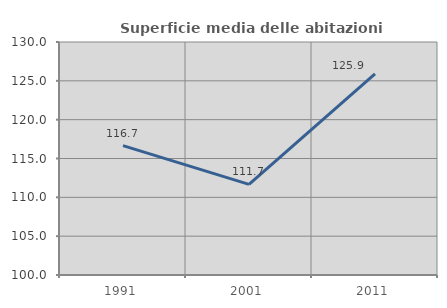
| Category | Superficie media delle abitazioni occupate |
|---|---|
| 1991.0 | 116.655 |
| 2001.0 | 111.667 |
| 2011.0 | 125.904 |